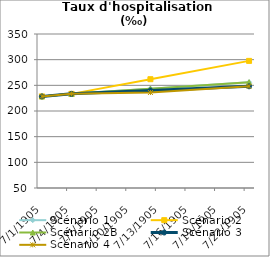
| Category | Scénario 1 | Scénario 2 | Scénario 2B | Scénario 3 | Scénario 4 |
|---|---|---|---|---|---|
| 2009.0 | 228.403 | 228.403 | 228.403 | 228.403 | 228.403 |
| 2012.0 | 233.386 | 233.386 | 233.386 | 233.386 | 233.386 |
| 2020.0 | 243.479 | 261.935 | 243.479 | 239.936 | 235.995 |
| 2030.0 | 256.097 | 297.621 | 256.097 | 248.124 | 248.124 |